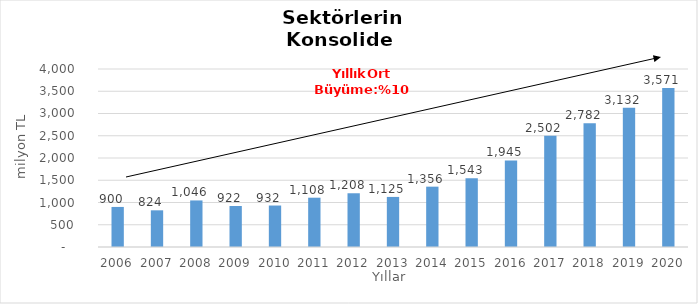
| Category | Toplam |
|---|---|
| 2006.0 | 900.249 |
| 2007.0 | 824.279 |
| 2008.0 | 1046.34 |
| 2009.0 | 921.592 |
| 2010.0 | 931.985 |
| 2011.0 | 1107.741 |
| 2012.0 | 1207.621 |
| 2013.0 | 1125.414 |
| 2014.0 | 1355.909 |
| 2015.0 | 1543 |
| 2016.0 | 1945 |
| 2017.0 | 2502 |
| 2018.0 | 2782 |
| 2019.0 | 3132 |
| 2020.0 | 3571 |